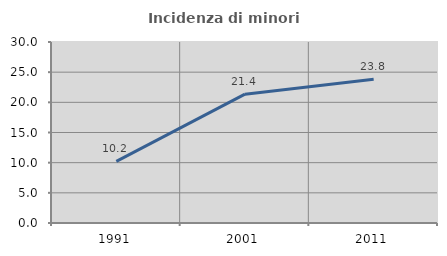
| Category | Incidenza di minori stranieri |
|---|---|
| 1991.0 | 10.204 |
| 2001.0 | 21.354 |
| 2011.0 | 23.834 |